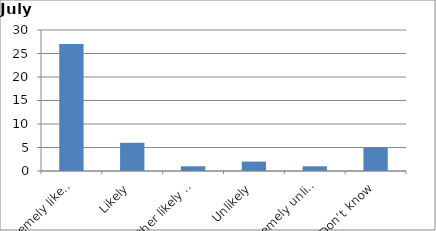
| Category | Series 0 |
|---|---|
| Extremely likely | 27 |
| Likely | 6 |
| Neither likely nor unlikely | 1 |
| Unlikely | 2 |
| Extremely unlikely | 1 |
| Don’t know | 5 |